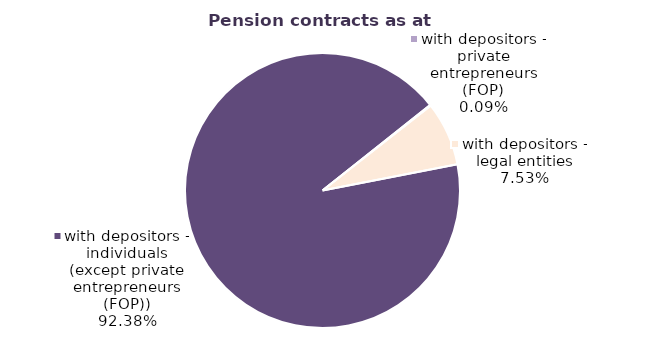
| Category | Series 0 |
|---|---|
| with depositors - individuals (except private entrepreneurs (FOP)) | 82921 |
| with depositors - private entrepreneurs (FOP) | 84 |
| with depositors - legal entities | 6758 |